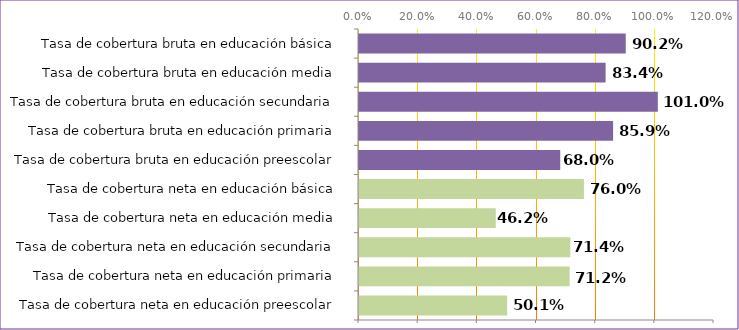
| Category | Series 0 |
|---|---|
| Tasa de cobertura neta en educación preescolar | 0.501 |
| Tasa de cobertura neta en educación primaria | 0.712 |
| Tasa de cobertura neta en educación secundaria | 0.714 |
| Tasa de cobertura neta en educación media | 0.462 |
| Tasa de cobertura neta en educación básica | 0.76 |
| Tasa de cobertura bruta en educación preescolar | 0.68 |
| Tasa de cobertura bruta en educación primaria | 0.859 |
| Tasa de cobertura bruta en educación secundaria | 1.01 |
| Tasa de cobertura bruta en educación media | 0.834 |
| Tasa de cobertura bruta en educación básica | 0.902 |